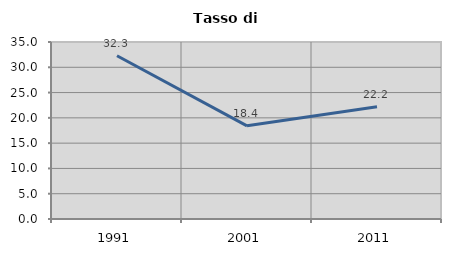
| Category | Tasso di disoccupazione   |
|---|---|
| 1991.0 | 32.288 |
| 2001.0 | 18.428 |
| 2011.0 | 22.217 |